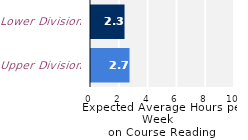
| Category | Series 0 |
|---|---|
| Upper Division | 2.675 |
| Lower Division | 2.329 |